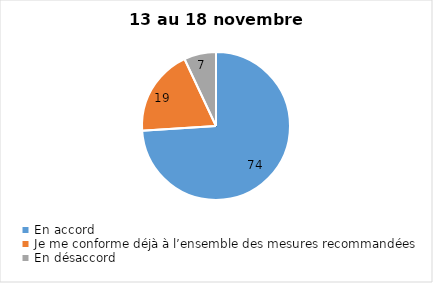
| Category | Series 0 |
|---|---|
| En accord | 74 |
| Je me conforme déjà à l’ensemble des mesures recommandées | 19 |
| En désaccord | 7 |